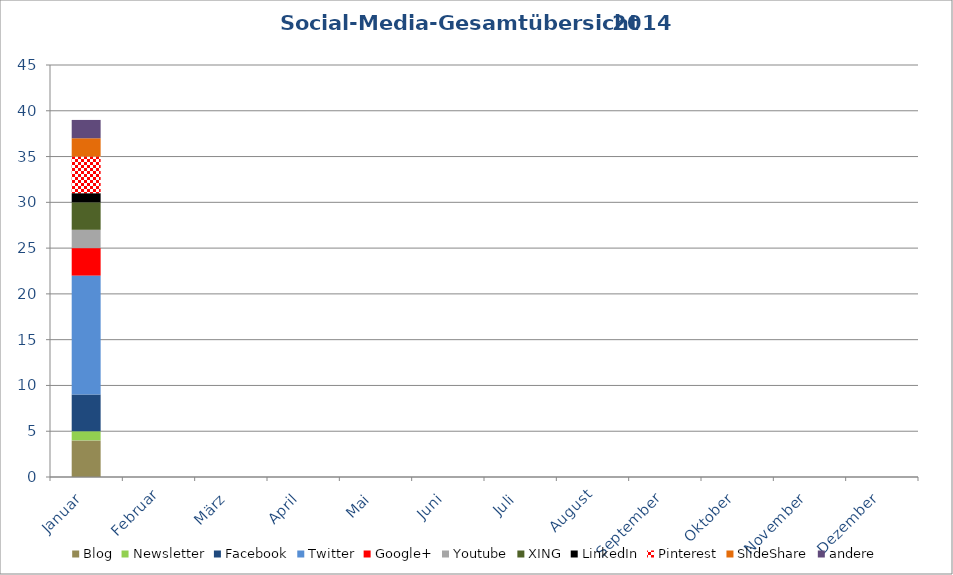
| Category | Blog | Newsletter | Facebook | Twitter | Google+ | Youtube | XING | LinkedIn | Pinterest | SlideShare | andere |
|---|---|---|---|---|---|---|---|---|---|---|---|
| Januar | 4 | 1 | 4 | 13 | 3 | 2 | 3 | 1 | 4 | 2 | 2 |
| Februar | 0 | 0 | 0 | 0 | 0 | 0 | 0 | 0 | 0 | 0 | 0 |
| März | 0 | 0 | 0 | 0 | 0 | 0 | 0 | 0 | 0 | 0 | 0 |
| April | 0 | 0 | 0 | 0 | 0 | 0 | 0 | 0 | 0 | 0 | 0 |
| Mai | 0 | 0 | 0 | 0 | 0 | 0 | 0 | 0 | 0 | 0 | 0 |
| Juni | 0 | 0 | 0 | 0 | 0 | 0 | 0 | 0 | 0 | 0 | 0 |
| Juli | 0 | 0 | 0 | 0 | 0 | 0 | 0 | 0 | 0 | 0 | 0 |
| August | 0 | 0 | 0 | 0 | 0 | 0 | 0 | 0 | 0 | 0 | 0 |
| September | 0 | 0 | 0 | 0 | 0 | 0 | 0 | 0 | 0 | 0 | 0 |
| Oktober | 0 | 0 | 0 | 0 | 0 | 0 | 0 | 0 | 0 | 0 | 0 |
| November | 0 | 0 | 0 | 0 | 0 | 0 | 0 | 0 | 0 | 0 | 0 |
| Dezember | 0 | 0 | 0 | 0 | 0 | 0 | 0 | 0 | 0 | 0 | 0 |